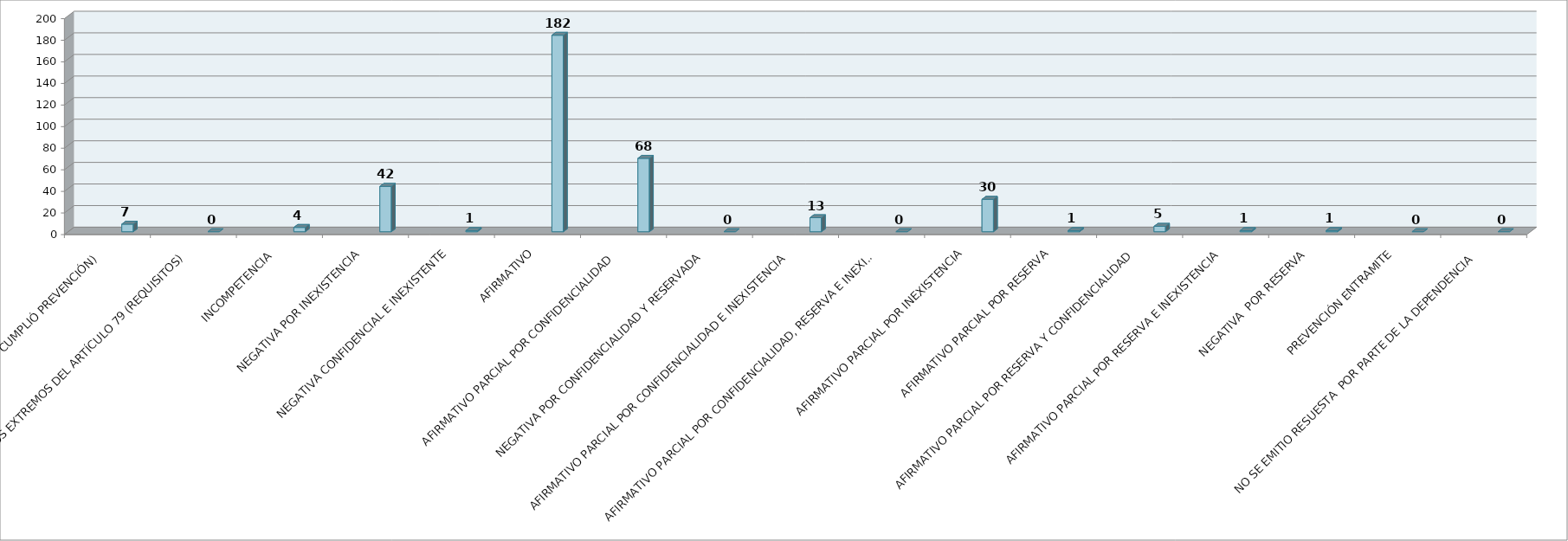
| Category | Series 0 | Series 1 | Series 2 | Series 3 | Series 4 | Series 5 |
|---|---|---|---|---|---|---|
| SE TIENE POR NO PRESENTADA ( NO CUMPLIÓ PREVENCIÓN) |  |  |  |  | 7 |  |
| NO CUMPLIO CON LOS EXTREMOS DEL ARTÍCULO 79 (REQUISITOS) |  |  |  |  | 0 |  |
| INCOMPETENCIA  |  |  |  |  | 4 |  |
| NEGATIVA POR INEXISTENCIA |  |  |  |  | 42 |  |
| NEGATIVA CONFIDENCIAL E INEXISTENTE |  |  |  |  | 1 |  |
| AFIRMATIVO |  |  |  |  | 182 |  |
| AFIRMATIVO PARCIAL POR CONFIDENCIALIDAD  |  |  |  |  | 68 |  |
| NEGATIVA POR CONFIDENCIALIDAD Y RESERVADA |  |  |  |  | 0 |  |
| AFIRMATIVO PARCIAL POR CONFIDENCIALIDAD E INEXISTENCIA |  |  |  |  | 13 |  |
| AFIRMATIVO PARCIAL POR CONFIDENCIALIDAD, RESERVA E INEXISTENCIA |  |  |  |  | 0 |  |
| AFIRMATIVO PARCIAL POR INEXISTENCIA |  |  |  |  | 30 |  |
| AFIRMATIVO PARCIAL POR RESERVA |  |  |  |  | 1 |  |
| AFIRMATIVO PARCIAL POR RESERVA Y CONFIDENCIALIDAD |  |  |  |  | 5 |  |
| AFIRMATIVO PARCIAL POR RESERVA E INEXISTENCIA |  |  |  |  | 1 |  |
| NEGATIVA  POR RESERVA |  |  |  |  | 1 |  |
| PREVENCIÓN ENTRAMITE |  |  |  |  | 0 |  |
| NO SE EMITIO RESUESTA  POR PARTE DE LA DEPENDENCIA |  |  |  |  | 0 |  |